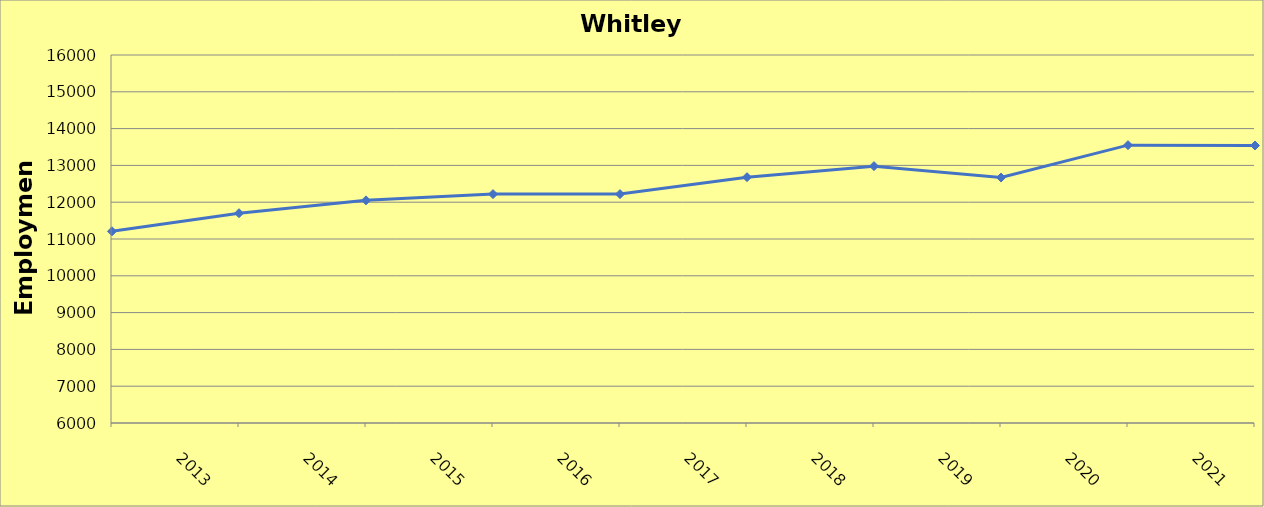
| Category | Whitley County |
|---|---|
| 2013.0 | 11210 |
| 2014.0 | 11700 |
| 2015.0 | 12050 |
| 2016.0 | 12220 |
| 2017.0 | 12220 |
| 2018.0 | 12680 |
| 2019.0 | 12980 |
| 2020.0 | 12670 |
| 2021.0 | 13550 |
| 2022.0 | 13540 |